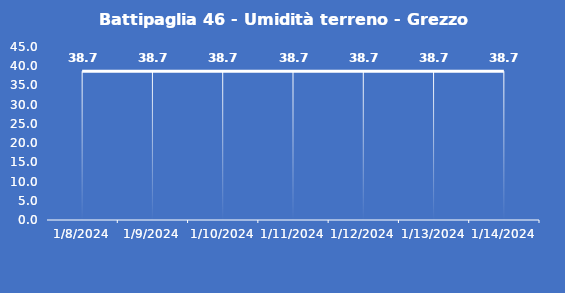
| Category | Battipaglia 46 - Umidità terreno - Grezzo (%VWC) |
|---|---|
| 1/8/24 | 38.7 |
| 1/9/24 | 38.7 |
| 1/10/24 | 38.7 |
| 1/11/24 | 38.7 |
| 1/12/24 | 38.7 |
| 1/13/24 | 38.7 |
| 1/14/24 | 38.7 |